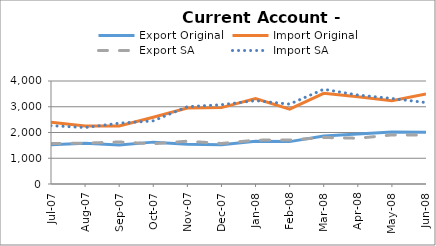
| Category | Export Original | Import Original | Export SA | Import SA |
|---|---|---|---|---|
| 2007-07-31 | 1528 | 2399 | 1570 | 2267 |
| 2007-08-31 | 1579 | 2256 | 1585 | 2193 |
| 2007-09-30 | 1510 | 2252 | 1632 | 2360 |
| 2007-10-31 | 1626 | 2593 | 1562 | 2452 |
| 2007-11-30 | 1545 | 2948 | 1663 | 3002 |
| 2007-12-31 | 1526 | 2966 | 1574 | 3078 |
| 2008-01-31 | 1660 | 3318 | 1703 | 3239 |
| 2008-02-29 | 1646 | 2910 | 1707 | 3102 |
| 2008-03-31 | 1862 | 3520 | 1807 | 3679 |
| 2008-04-30 | 1938 | 3384 | 1777 | 3456 |
| 2008-05-31 | 2017 | 3237 | 1905 | 3320 |
| 2008-06-30 | 2011 | 3499 | 1899 | 3162 |